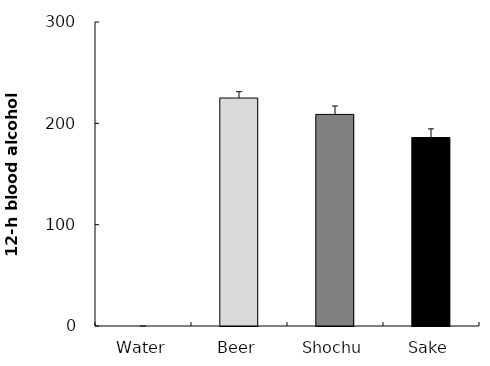
| Category | Series 0 |
|---|---|
| Water | 0 |
| Beer | 225 |
| Shochu | 208.8 |
| Sake | 186 |